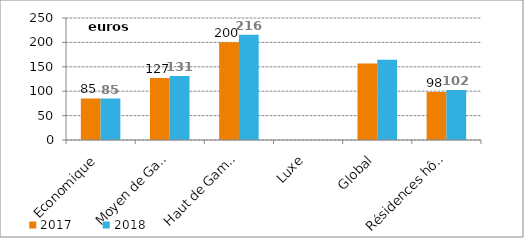
| Category | 2017 | 2018 |
|---|---|---|
| Economique | 85.077 | 84.998 |
| Moyen de Gamme | 127.249 | 131.223 |
| Haut de Gamme | 200.271 | 215.93 |
| Luxe | 0 | 0 |
| Global | 156.585 | 164.518 |
| Résidences hôtelières | 98.11 | 102.348 |